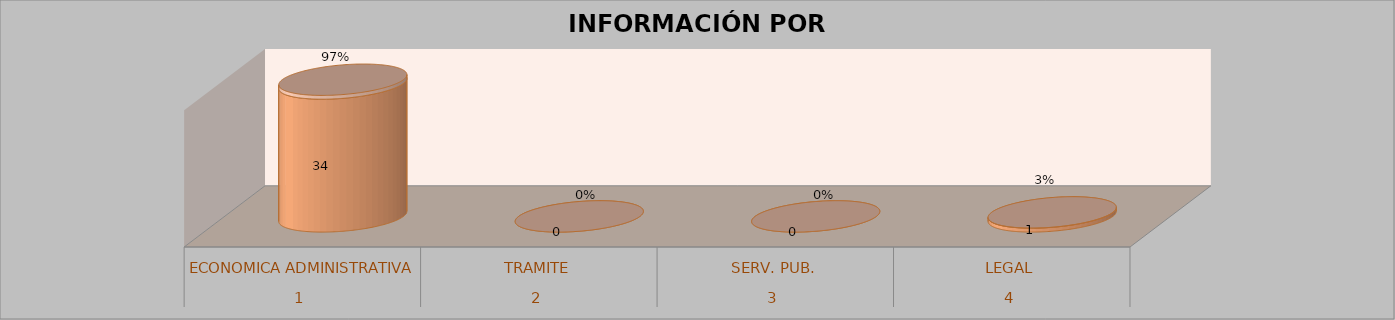
| Category | Series 0 | Series 1 | Series 2 | Series 3 |
|---|---|---|---|---|
| 0 |  |  | 34 | 0.971 |
| 1 |  |  | 0 | 0 |
| 2 |  |  | 0 | 0 |
| 3 |  |  | 1 | 0.029 |